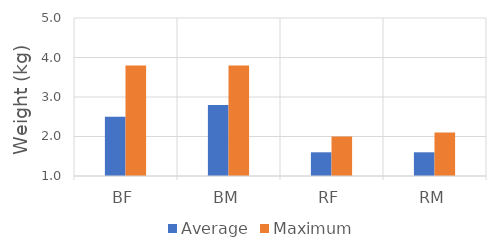
| Category | Average | Maximum |
|---|---|---|
| BF | 2.5 | 3.8 |
| BM | 2.8 | 3.8 |
| RF | 1.6 | 2 |
| RM | 1.6 | 2.1 |